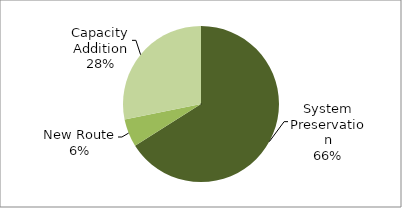
| Category | Series 0 |
|---|---|
| System Preservation | 0.66 |
| New Route | 0.058 |
| Capacity Addition | 0.282 |